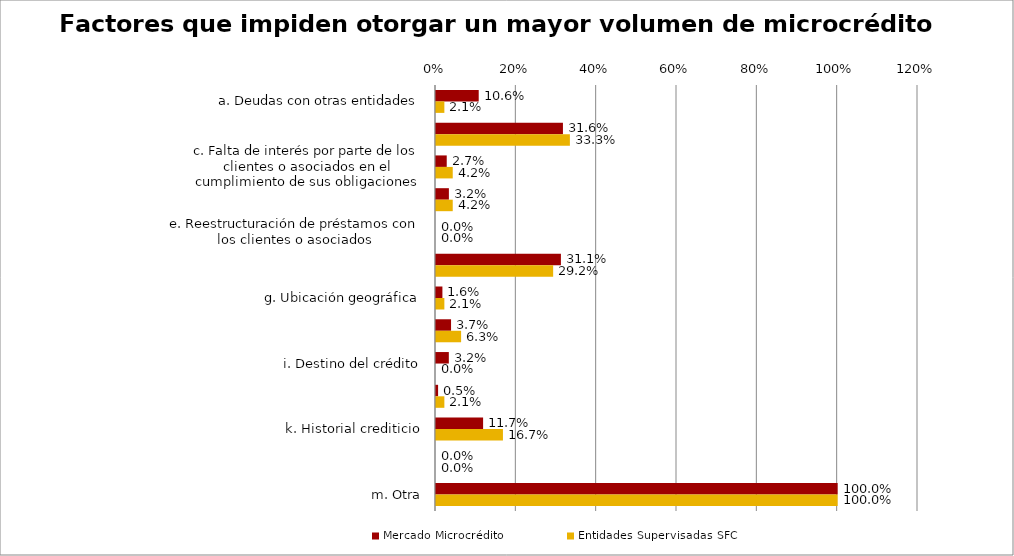
| Category | Mercado Microcrédito | Entidades Supervisadas SFC |
|---|---|---|
| a. Deudas con otras entidades | 0.106 | 0.021 |
| b. Capacidad de pago de los clientes | 0.316 | 0.333 |
| c. Falta de interés por parte de los clientes o asociados en el cumplimiento de sus obligaciones | 0.027 | 0.042 |
| d. Actividad económica del cliente o asocidado | 0.032 | 0.042 |
| e. Reestructuración de préstamos con los clientes o asociados | 0 | 0 |
| f. El nivel de deuda del cliente, con su entidad o con otras instituciones, es superior a su capacidad de pago (sobrendeudamiento) | 0.311 | 0.292 |
| g. Ubicación geográfica | 0.016 | 0.021 |
| h. Poca experiencia en su actividad económica | 0.037 | 0.062 |
| i. Destino del crédito | 0.032 | 0 |
| j. Falta de información financiera de los nuevos clientes o asociados | 0.005 | 0.021 |
| k. Historial crediticio | 0.117 | 0.167 |
| l. Medidas adoptadas por los entes reguladores | 0 | 0 |
| m. Otra | 1 | 1 |